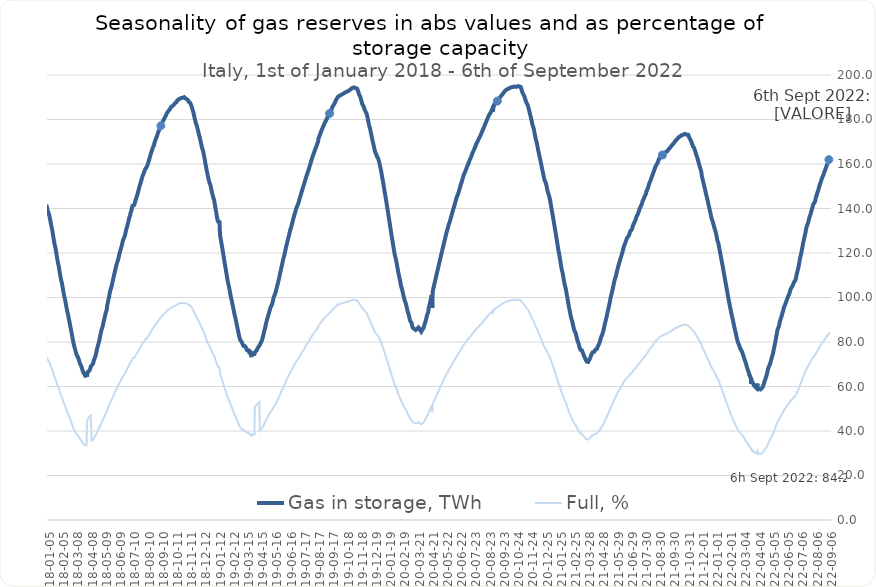
| Category | Gas in storage, TWh  | Full, %  |
|---|---|---|
| 2022-09-06 | 162.872 | 84.2 |
| 2022-09-05 | 162.35 | 83.93 |
| 2022-09-04 | 161.97 | 83.73 |
| 2022-09-03 | 161.345 | 83.41 |
| 2022-09-02 | 160.709 | 83.08 |
| 2022-09-01 | 160.45 | 82.94 |
| 2022-08-31 | 159.708 | 82.56 |
| 2022-08-30 | 159.123 | 82.26 |
| 2022-08-29 | 158.492 | 81.93 |
| 2022-08-28 | 158.041 | 81.7 |
| 2022-08-27 | 157.29 | 81.31 |
| 2022-08-26 | 156.754 | 81.03 |
| 2022-08-25 | 156.246 | 80.77 |
| 2022-08-24 | 155.674 | 80.48 |
| 2022-08-23 | 154.972 | 80.11 |
| 2022-08-22 | 154.606 | 79.92 |
| 2022-08-21 | 154.208 | 79.72 |
| 2022-08-20 | 153.574 | 79.39 |
| 2022-08-19 | 152.993 | 79.09 |
| 2022-08-18 | 152.321 | 78.74 |
| 2022-08-17 | 151.741 | 78.44 |
| 2022-08-16 | 151.262 | 78.19 |
| 2022-08-15 | 150.541 | 77.82 |
| 2022-08-14 | 149.829 | 77.45 |
| 2022-08-13 | 149.06 | 77.06 |
| 2022-08-12 | 148.337 | 76.68 |
| 2022-08-11 | 147.712 | 76.36 |
| 2022-08-10 | 147.062 | 76.02 |
| 2022-08-09 | 146.415 | 75.69 |
| 2022-08-08 | 145.812 | 75.38 |
| 2022-08-07 | 145.12 | 75.02 |
| 2022-08-06 | 144.162 | 74.52 |
| 2022-08-05 | 143.279 | 74.07 |
| 2022-08-04 | 142.737 | 73.79 |
| 2022-08-03 | 142.758 | 73.8 |
| 2022-08-02 | 142.344 | 73.58 |
| 2022-08-01 | 141.959 | 73.39 |
| 2022-07-31 | 141.071 | 72.93 |
| 2022-07-30 | 140.351 | 72.55 |
| 2022-07-29 | 139.663 | 72.2 |
| 2022-07-28 | 138.897 | 71.8 |
| 2022-07-27 | 138.176 | 71.43 |
| 2022-07-26 | 137.379 | 71.02 |
| 2022-07-25 | 136.782 | 70.71 |
| 2022-07-24 | 136.329 | 70.47 |
| 2022-07-23 | 135.423 | 70.01 |
| 2022-07-22 | 134.559 | 69.56 |
| 2022-07-21 | 133.817 | 69.18 |
| 2022-07-20 | 133.2 | 68.86 |
| 2022-07-19 | 132.765 | 68.63 |
| 2022-07-18 | 132.088 | 68.28 |
| 2022-07-17 | 131.308 | 67.88 |
| 2022-07-16 | 130.341 | 67.38 |
| 2022-07-15 | 129.196 | 66.79 |
| 2022-07-14 | 128.237 | 66.29 |
| 2022-07-13 | 127.342 | 65.83 |
| 2022-07-12 | 126.37 | 65.33 |
| 2022-07-11 | 125.412 | 64.83 |
| 2022-07-10 | 124.56 | 64.39 |
| 2022-07-09 | 123.361 | 63.77 |
| 2022-07-08 | 122.182 | 63.16 |
| 2022-07-07 | 121.145 | 62.63 |
| 2022-07-06 | 120.201 | 62.14 |
| 2022-07-05 | 119.195 | 61.62 |
| 2022-07-04 | 118.281 | 61.15 |
| 2022-07-03 | 117.458 | 60.72 |
| 2022-07-02 | 116.25 | 60.09 |
| 2022-07-01 | 115.113 | 59.51 |
| 2022-06-30 | 113.938 | 58.9 |
| 2022-06-29 | 113.019 | 58.42 |
| 2022-06-28 | 112.217 | 58.01 |
| 2022-06-27 | 111.326 | 57.55 |
| 2022-06-26 | 110.682 | 57.22 |
| 2022-06-25 | 109.508 | 56.61 |
| 2022-06-24 | 108.452 | 56.06 |
| 2022-06-23 | 107.787 | 55.72 |
| 2022-06-22 | 107.475 | 55.56 |
| 2022-06-21 | 107.175 | 55.4 |
| 2022-06-20 | 106.853 | 55.24 |
| 2022-06-19 | 106.544 | 55.08 |
| 2022-06-18 | 105.864 | 54.73 |
| 2022-06-17 | 105.258 | 54.41 |
| 2022-06-16 | 105.01 | 54.28 |
| 2022-06-15 | 104.635 | 54.09 |
| 2022-06-14 | 104.267 | 53.9 |
| 2022-06-13 | 103.844 | 53.68 |
| 2022-06-12 | 103.383 | 53.44 |
| 2022-06-11 | 102.596 | 53.04 |
| 2022-06-10 | 101.836 | 52.64 |
| 2022-06-09 | 101.353 | 52.39 |
| 2022-06-08 | 100.882 | 52.15 |
| 2022-06-07 | 100.378 | 51.89 |
| 2022-06-06 | 99.886 | 51.64 |
| 2022-06-05 | 99.495 | 51.43 |
| 2022-06-04 | 98.809 | 51.08 |
| 2022-06-03 | 98.16 | 50.74 |
| 2022-06-02 | 97.629 | 50.47 |
| 2022-06-01 | 96.947 | 50.12 |
| 2022-05-31 | 96.492 | 49.88 |
| 2022-05-30 | 96.059 | 49.66 |
| 2022-05-29 | 95.584 | 49.41 |
| 2022-05-28 | 94.672 | 48.94 |
| 2022-05-27 | 93.783 | 48.48 |
| 2022-05-26 | 93.183 | 48.17 |
| 2022-05-25 | 92.345 | 47.74 |
| 2022-05-24 | 91.61 | 47.36 |
| 2022-05-23 | 90.958 | 47.02 |
| 2022-05-22 | 90.49 | 46.78 |
| 2022-05-21 | 89.772 | 46.41 |
| 2022-05-20 | 89.124 | 46.07 |
| 2022-05-19 | 88.078 | 45.53 |
| 2022-05-18 | 87.054 | 45 |
| 2022-05-17 | 86.562 | 44.75 |
| 2022-05-16 | 86.134 | 44.53 |
| 2022-05-15 | 85.562 | 44.23 |
| 2022-05-14 | 84.343 | 43.6 |
| 2022-05-13 | 83.141 | 42.98 |
| 2022-05-12 | 81.998 | 42.39 |
| 2022-05-11 | 80.837 | 41.79 |
| 2022-05-10 | 79.805 | 41.26 |
| 2022-05-09 | 78.788 | 40.73 |
| 2022-05-08 | 77.761 | 40.2 |
| 2022-05-07 | 76.726 | 39.66 |
| 2022-05-06 | 75.699 | 39.13 |
| 2022-05-05 | 74.766 | 38.65 |
| 2022-05-04 | 74.09 | 38.3 |
| 2022-05-03 | 73.32 | 37.9 |
| 2022-05-02 | 72.615 | 37.54 |
| 2022-05-01 | 71.844 | 37.14 |
| 2022-04-30 | 70.967 | 36.69 |
| 2022-04-29 | 70.32 | 36.35 |
| 2022-04-28 | 69.77 | 36.07 |
| 2022-04-27 | 69.292 | 35.82 |
| 2022-04-26 | 68.952 | 34.83 |
| 2022-04-25 | 68.342 | 34.53 |
| 2022-04-24 | 67.465 | 34.08 |
| 2022-04-23 | 66.532 | 33.61 |
| 2022-04-22 | 65.647 | 33.16 |
| 2022-04-21 | 64.895 | 32.78 |
| 2022-04-20 | 64.196 | 32.43 |
| 2022-04-19 | 63.521 | 32.09 |
| 2022-04-18 | 63.172 | 31.91 |
| 2022-04-17 | 62.491 | 31.57 |
| 2022-04-16 | 61.784 | 31.21 |
| 2022-04-15 | 61.071 | 30.85 |
| 2022-04-14 | 60.462 | 30.54 |
| 2022-04-13 | 59.87 | 30.25 |
| 2022-04-12 | 59.554 | 30.09 |
| 2022-04-11 | 59.234 | 29.92 |
| 2022-04-10 | 59.031 | 29.82 |
| 2022-04-09 | 58.866 | 29.74 |
| 2022-04-08 | 58.72 | 29.66 |
| 2022-04-07 | 58.642 | 29.62 |
| 2022-04-06 | 59.042 | 29.83 |
| 2022-04-05 | 59.036 | 29.82 |
| 2022-04-04 | 59.034 | 29.82 |
| 2022-04-03 | 59.03 | 29.82 |
| 2022-04-02 | 59.012 | 30.19 |
| 2022-04-01 | 61.308 | 30.97 |
| 2022-03-31 | 59.16 | 29.92 |
| 2022-03-30 | 58.945 | 29.81 |
| 2022-03-29 | 59.321 | 30 |
| 2022-03-28 | 59.724 | 30.2 |
| 2022-03-27 | 60.119 | 30.4 |
| 2022-03-26 | 60.022 | 30.36 |
| 2022-03-25 | 60.402 | 30.55 |
| 2022-03-24 | 60.787 | 30.74 |
| 2022-03-23 | 61.212 | 30.96 |
| 2022-03-22 | 61.689 | 31.2 |
| 2022-03-21 | 62.172 | 31.44 |
| 2022-03-20 | 62.66 | 31.69 |
| 2022-03-19 | 61.152 | 30.93 |
| 2022-03-18 | 63.49 | 32.11 |
| 2022-03-17 | 63.977 | 32.36 |
| 2022-03-16 | 64.481 | 32.61 |
| 2022-03-15 | 65.002 | 32.87 |
| 2022-03-14 | 65.624 | 33.19 |
| 2022-03-13 | 66.428 | 33.59 |
| 2022-03-12 | 66.974 | 33.87 |
| 2022-03-11 | 67.6 | 34.19 |
| 2022-03-10 | 68.318 | 34.55 |
| 2022-03-09 | 68.959 | 34.87 |
| 2022-03-08 | 69.676 | 35.24 |
| 2022-03-07 | 70.396 | 35.6 |
| 2022-03-06 | 71.113 | 35.96 |
| 2022-03-05 | 71.677 | 36.25 |
| 2022-03-04 | 72.236 | 36.53 |
| 2022-03-03 | 72.896 | 36.87 |
| 2022-03-02 | 73.564 | 37.2 |
| 2022-03-01 | 74.172 | 37.51 |
| 2022-02-28 | 74.779 | 37.82 |
| 2022-02-27 | 75.546 | 38.21 |
| 2022-02-26 | 75.96 | 38.42 |
| 2022-02-25 | 76.254 | 38.56 |
| 2022-02-24 | 76.321 | 38.6 |
| 2022-02-23 | 76.935 | 38.91 |
| 2022-02-22 | 77.528 | 39.21 |
| 2022-02-21 | 78.14 | 39.52 |
| 2022-02-20 | 78.788 | 39.85 |
| 2022-02-19 | 79.162 | 40.03 |
| 2022-02-18 | 79.639 | 40.28 |
| 2022-02-17 | 80.402 | 40.66 |
| 2022-02-16 | 81.181 | 41.06 |
| 2022-02-15 | 82.035 | 41.49 |
| 2022-02-14 | 82.911 | 41.93 |
| 2022-02-13 | 83.946 | 42.45 |
| 2022-02-12 | 84.77 | 42.87 |
| 2022-02-11 | 85.626 | 43.3 |
| 2022-02-10 | 86.522 | 43.76 |
| 2022-02-09 | 87.49 | 44.25 |
| 2022-02-08 | 88.476 | 44.75 |
| 2022-02-07 | 89.513 | 45.27 |
| 2022-02-06 | 90.544 | 45.79 |
| 2022-02-05 | 91.314 | 46.18 |
| 2022-02-04 | 92.19 | 46.62 |
| 2022-02-03 | 93.178 | 47.12 |
| 2022-02-02 | 94.214 | 47.65 |
| 2022-02-01 | 95.256 | 48.17 |
| 2022-01-31 | 96.259 | 48.68 |
| 2022-01-30 | 97.384 | 49.25 |
| 2022-01-29 | 98.365 | 49.75 |
| 2022-01-28 | 99.469 | 50.3 |
| 2022-01-27 | 100.629 | 50.89 |
| 2022-01-26 | 101.806 | 51.49 |
| 2022-01-25 | 102.969 | 52.07 |
| 2022-01-24 | 104.146 | 52.67 |
| 2022-01-23 | 105.306 | 53.26 |
| 2022-01-22 | 106.374 | 53.8 |
| 2022-01-21 | 107.535 | 54.38 |
| 2022-01-20 | 108.709 | 54.98 |
| 2022-01-19 | 109.89 | 55.57 |
| 2022-01-18 | 111.066 | 56.17 |
| 2022-01-17 | 112.235 | 56.76 |
| 2022-01-16 | 113.414 | 57.36 |
| 2022-01-15 | 114.538 | 57.93 |
| 2022-01-14 | 115.612 | 58.47 |
| 2022-01-13 | 116.724 | 59.03 |
| 2022-01-12 | 117.832 | 59.59 |
| 2022-01-11 | 118.944 | 60.15 |
| 2022-01-10 | 120.019 | 60.7 |
| 2022-01-09 | 121.129 | 61.26 |
| 2022-01-08 | 122.224 | 61.81 |
| 2022-01-07 | 123.327 | 62.37 |
| 2022-01-06 | 124.41 | 62.92 |
| 2022-01-05 | 124.47 | 62.95 |
| 2022-01-04 | 125.514 | 63.48 |
| 2022-01-03 | 126.552 | 64 |
| 2022-01-02 | 127.629 | 64.55 |
| 2022-01-01 | 128.603 | 65.04 |
| 2021-12-31 | 129.45 | 65.47 |
| 2021-12-30 | 130.162 | 65.83 |
| 2021-12-29 | 130.854 | 66.18 |
| 2021-12-28 | 131.557 | 66.53 |
| 2021-12-27 | 132.347 | 66.93 |
| 2021-12-26 | 133.06 | 67.29 |
| 2021-12-25 | 133.837 | 67.69 |
| 2021-12-24 | 134.454 | 68 |
| 2021-12-23 | 135.062 | 68.31 |
| 2021-12-22 | 135.7 | 68.63 |
| 2021-12-21 | 136.714 | 69.14 |
| 2021-12-20 | 137.656 | 69.62 |
| 2021-12-19 | 138.596 | 70.09 |
| 2021-12-18 | 139.517 | 70.56 |
| 2021-12-17 | 140.426 | 71.02 |
| 2021-12-16 | 141.363 | 71.49 |
| 2021-12-15 | 142.287 | 71.96 |
| 2021-12-14 | 143.219 | 72.43 |
| 2021-12-13 | 144.085 | 72.87 |
| 2021-12-12 | 144.962 | 73.31 |
| 2021-12-11 | 145.824 | 73.75 |
| 2021-12-10 | 146.699 | 74.19 |
| 2021-12-09 | 147.574 | 74.63 |
| 2021-12-08 | 148.472 | 75.09 |
| 2021-12-07 | 149.364 | 75.54 |
| 2021-12-06 | 150.25 | 75.99 |
| 2021-12-05 | 151.138 | 76.44 |
| 2021-12-04 | 151.973 | 76.86 |
| 2021-12-03 | 152.817 | 77.28 |
| 2021-12-02 | 153.699 | 77.73 |
| 2021-12-01 | 154.587 | 78.18 |
| 2021-11-30 | 156.245 | 79.02 |
| 2021-11-29 | 157.044 | 79.42 |
| 2021-11-28 | 157.835 | 79.82 |
| 2021-11-27 | 158.416 | 80.12 |
| 2021-11-26 | 159.065 | 80.44 |
| 2021-11-25 | 159.848 | 80.84 |
| 2021-11-24 | 160.629 | 81.24 |
| 2021-11-23 | 161.408 | 81.63 |
| 2021-11-22 | 162.14 | 82 |
| 2021-11-21 | 162.91 | 82.39 |
| 2021-11-20 | 163.377 | 82.62 |
| 2021-11-19 | 163.963 | 82.92 |
| 2021-11-18 | 164.635 | 83.26 |
| 2021-11-17 | 165.386 | 83.64 |
| 2021-11-16 | 166.07 | 83.99 |
| 2021-11-15 | 166.657 | 84.28 |
| 2021-11-14 | 167.248 | 84.58 |
| 2021-11-13 | 167.47 | 84.69 |
| 2021-11-12 | 167.755 | 84.84 |
| 2021-11-11 | 168.324 | 85.13 |
| 2021-11-10 | 168.84 | 85.39 |
| 2021-11-09 | 169.423 | 85.68 |
| 2021-11-08 | 170.035 | 85.99 |
| 2021-11-07 | 170.576 | 86.27 |
| 2021-11-06 | 170.798 | 86.38 |
| 2021-11-05 | 171.193 | 86.58 |
| 2021-11-04 | 171.691 | 86.83 |
| 2021-11-03 | 172.202 | 87.09 |
| 2021-11-02 | 172.685 | 87.33 |
| 2021-11-01 | 173.16 | 87.57 |
| 2021-10-31 | 173.108 | 87.55 |
| 2021-10-30 | 173.121 | 87.55 |
| 2021-10-29 | 173.155 | 87.57 |
| 2021-10-28 | 173.207 | 87.6 |
| 2021-10-27 | 173.335 | 87.66 |
| 2021-10-26 | 173.49 | 87.74 |
| 2021-10-25 | 173.563 | 87.78 |
| 2021-10-24 | 173.6 | 87.79 |
| 2021-10-23 | 173.409 | 87.7 |
| 2021-10-22 | 173.301 | 87.64 |
| 2021-10-21 | 173.305 | 87.65 |
| 2021-10-20 | 172.997 | 87.49 |
| 2021-10-19 | 172.911 | 87.45 |
| 2021-10-18 | 172.916 | 87.45 |
| 2021-10-17 | 172.871 | 87.43 |
| 2021-10-16 | 172.601 | 87.29 |
| 2021-10-15 | 172.42 | 87.2 |
| 2021-10-14 | 172.367 | 87.17 |
| 2021-10-13 | 172.243 | 87.11 |
| 2021-10-12 | 172.102 | 87.04 |
| 2021-10-11 | 171.944 | 86.96 |
| 2021-10-10 | 171.813 | 86.89 |
| 2021-10-09 | 171.438 | 86.7 |
| 2021-10-08 | 171.078 | 86.52 |
| 2021-10-07 | 170.933 | 86.45 |
| 2021-10-06 | 170.767 | 86.36 |
| 2021-10-05 | 170.573 | 86.26 |
| 2021-10-04 | 170.346 | 86.15 |
| 2021-10-03 | 170.125 | 86.04 |
| 2021-10-02 | 169.728 | 85.84 |
| 2021-10-01 | 169.337 | 85.64 |
| 2021-09-30 | 169.153 | 85.55 |
| 2021-09-29 | 168.912 | 85.42 |
| 2021-09-28 | 168.725 | 85.33 |
| 2021-09-27 | 168.62 | 85.28 |
| 2021-09-26 | 168.429 | 85.18 |
| 2021-09-25 | 167.951 | 84.94 |
| 2021-09-24 | 167.562 | 84.74 |
| 2021-09-23 | 167.392 | 84.66 |
| 2021-09-22 | 167.218 | 84.57 |
| 2021-09-21 | 167.013 | 84.46 |
| 2021-09-20 | 166.819 | 84.37 |
| 2021-09-19 | 166.583 | 84.25 |
| 2021-09-18 | 166.174 | 84.04 |
| 2021-09-17 | 165.818 | 83.86 |
| 2021-09-16 | 165.607 | 83.75 |
| 2021-09-15 | 165.548 | 83.72 |
| 2021-09-14 | 165.456 | 83.68 |
| 2021-09-13 | 165.402 | 83.65 |
| 2021-09-12 | 165.285 | 83.59 |
| 2021-09-11 | 164.949 | 83.42 |
| 2021-09-10 | 164.711 | 83.3 |
| 2021-09-09 | 164.507 | 83.2 |
| 2021-09-08 | 164.312 | 83.1 |
| 2021-09-07 | 164.191 | 83.04 |
| 2021-09-06 | 164.057 | 82.97 |
| 2021-09-05 | 163.673 | 82.77 |
| 2021-09-04 | 163.307 | 82.59 |
| 2021-09-03 | 163.072 | 82.47 |
| 2021-09-02 | 162.993 | 82.43 |
| 2021-09-01 | 162.846 | 82.36 |
| 2021-08-31 | 162.735 | 82.3 |
| 2021-08-30 | 162.465 | 82.16 |
| 2021-08-29 | 162.07 | 81.96 |
| 2021-08-28 | 161.401 | 81.63 |
| 2021-08-27 | 160.776 | 81.31 |
| 2021-08-26 | 160.318 | 81.08 |
| 2021-08-25 | 159.985 | 80.91 |
| 2021-08-24 | 159.661 | 80.75 |
| 2021-08-23 | 159.333 | 80.58 |
| 2021-08-22 | 158.908 | 80.36 |
| 2021-08-21 | 158.325 | 80.07 |
| 2021-08-20 | 157.735 | 79.77 |
| 2021-08-19 | 157.098 | 79.45 |
| 2021-08-18 | 156.551 | 79.17 |
| 2021-08-17 | 155.996 | 78.89 |
| 2021-08-16 | 155.424 | 78.6 |
| 2021-08-15 | 154.879 | 78.33 |
| 2021-08-14 | 154.307 | 78.04 |
| 2021-08-13 | 153.666 | 77.71 |
| 2021-08-12 | 153.137 | 77.45 |
| 2021-08-11 | 152.571 | 77.16 |
| 2021-08-10 | 152.242 | 76.99 |
| 2021-08-09 | 151.635 | 76.69 |
| 2021-08-08 | 151.059 | 76.4 |
| 2021-08-07 | 150.346 | 76.03 |
| 2021-08-06 | 149.635 | 75.68 |
| 2021-08-05 | 149.03 | 75.37 |
| 2021-08-04 | 148.503 | 75.1 |
| 2021-08-03 | 148.064 | 74.88 |
| 2021-08-02 | 147.627 | 74.66 |
| 2021-08-01 | 146.545 | 74.11 |
| 2021-07-31 | 146.464 | 74.07 |
| 2021-07-30 | 145.83 | 73.75 |
| 2021-07-29 | 145.323 | 73.49 |
| 2021-07-28 | 144.826 | 73.24 |
| 2021-07-27 | 144.308 | 72.98 |
| 2021-07-26 | 143.91 | 72.78 |
| 2021-07-25 | 143.47 | 72.56 |
| 2021-07-24 | 142.742 | 72.19 |
| 2021-07-23 | 142.017 | 71.82 |
| 2021-07-22 | 141.524 | 71.57 |
| 2021-07-21 | 141.085 | 71.35 |
| 2021-07-20 | 140.65 | 71.13 |
| 2021-07-19 | 140.2 | 70.9 |
| 2021-07-18 | 139.741 | 70.67 |
| 2021-07-17 | 138.992 | 70.29 |
| 2021-07-16 | 138.35 | 69.97 |
| 2021-07-15 | 137.857 | 69.72 |
| 2021-07-14 | 137.368 | 69.47 |
| 2021-07-13 | 136.888 | 69.23 |
| 2021-07-12 | 136.474 | 69.02 |
| 2021-07-11 | 136.109 | 68.83 |
| 2021-07-10 | 135.384 | 68.47 |
| 2021-07-09 | 134.709 | 68.13 |
| 2021-07-08 | 134.257 | 67.9 |
| 2021-07-07 | 133.802 | 67.67 |
| 2021-07-06 | 133.398 | 67.46 |
| 2021-07-05 | 132.944 | 67.23 |
| 2021-07-04 | 132.436 | 66.98 |
| 2021-07-03 | 131.705 | 66.61 |
| 2021-07-02 | 131.007 | 66.25 |
| 2021-07-01 | 130.516 | 66.01 |
| 2021-06-30 | 130.417 | 65.96 |
| 2021-06-29 | 130.188 | 65.84 |
| 2021-06-28 | 129.804 | 65.65 |
| 2021-06-27 | 129.339 | 65.41 |
| 2021-06-26 | 128.6 | 65.04 |
| 2021-06-25 | 127.922 | 64.69 |
| 2021-06-24 | 127.578 | 64.52 |
| 2021-06-23 | 127.344 | 64.4 |
| 2021-06-22 | 127.108 | 64.28 |
| 2021-06-21 | 126.763 | 64.11 |
| 2021-06-20 | 126.445 | 63.95 |
| 2021-06-19 | 125.748 | 63.59 |
| 2021-06-18 | 125.085 | 63.26 |
| 2021-06-17 | 124.523 | 62.98 |
| 2021-06-16 | 124.033 | 62.73 |
| 2021-06-15 | 123.514 | 62.46 |
| 2021-06-14 | 122.902 | 62.16 |
| 2021-06-13 | 122.205 | 61.8 |
| 2021-06-12 | 121.389 | 61.39 |
| 2021-06-11 | 120.574 | 60.98 |
| 2021-06-10 | 119.816 | 60.59 |
| 2021-06-09 | 119.094 | 60.23 |
| 2021-06-08 | 118.48 | 59.92 |
| 2021-06-07 | 117.828 | 59.59 |
| 2021-06-06 | 117.188 | 59.27 |
| 2021-06-05 | 116.373 | 58.85 |
| 2021-06-04 | 115.669 | 58.5 |
| 2021-06-03 | 114.982 | 58.15 |
| 2021-06-02 | 114.275 | 57.79 |
| 2021-06-01 | 113.483 | 57.39 |
| 2021-05-31 | 112.844 | 57.07 |
| 2021-05-30 | 112.013 | 56.65 |
| 2021-05-29 | 111.018 | 56.15 |
| 2021-05-28 | 110.033 | 55.65 |
| 2021-05-27 | 109.281 | 55.27 |
| 2021-05-26 | 108.714 | 54.98 |
| 2021-05-25 | 108.03 | 54.63 |
| 2021-05-24 | 107.144 | 54.19 |
| 2021-05-23 | 106.264 | 53.74 |
| 2021-05-22 | 105.196 | 53.2 |
| 2021-05-21 | 104.126 | 52.66 |
| 2021-05-20 | 103.231 | 52.21 |
| 2021-05-19 | 102.319 | 51.75 |
| 2021-05-18 | 101.621 | 51.39 |
| 2021-05-17 | 100.796 | 50.98 |
| 2021-05-16 | 99.885 | 50.51 |
| 2021-05-15 | 98.809 | 49.97 |
| 2021-05-14 | 97.741 | 49.43 |
| 2021-05-13 | 96.763 | 48.94 |
| 2021-05-12 | 95.831 | 48.46 |
| 2021-05-11 | 94.904 | 48 |
| 2021-05-10 | 93.985 | 47.53 |
| 2021-05-09 | 93.055 | 47.06 |
| 2021-05-08 | 92.051 | 46.55 |
| 2021-05-07 | 91.074 | 46.06 |
| 2021-05-06 | 90.228 | 45.63 |
| 2021-05-05 | 89.363 | 45.19 |
| 2021-05-04 | 88.539 | 44.78 |
| 2021-05-03 | 87.658 | 44.33 |
| 2021-05-02 | 86.828 | 43.91 |
| 2021-05-01 | 85.801 | 43.39 |
| 2021-04-30 | 84.868 | 42.92 |
| 2021-04-29 | 84.199 | 42.58 |
| 2021-04-28 | 83.495 | 42.23 |
| 2021-04-27 | 82.95 | 41.95 |
| 2021-04-26 | 82.618 | 41.78 |
| 2021-04-25 | 82.034 | 41.49 |
| 2021-04-24 | 81.236 | 41.08 |
| 2021-04-23 | 80.411 | 40.67 |
| 2021-04-22 | 79.762 | 40.34 |
| 2021-04-21 | 79.238 | 40.07 |
| 2021-04-20 | 78.807 | 39.86 |
| 2021-04-19 | 78.449 | 39.67 |
| 2021-04-18 | 78.08 | 39.49 |
| 2021-04-17 | 77.477 | 39.18 |
| 2021-04-16 | 76.899 | 38.89 |
| 2021-04-15 | 76.636 | 38.76 |
| 2021-04-14 | 76.613 | 38.75 |
| 2021-04-13 | 76.599 | 38.74 |
| 2021-04-12 | 76.486 | 38.68 |
| 2021-04-11 | 76.282 | 38.58 |
| 2021-04-10 | 75.564 | 38.22 |
| 2021-04-09 | 75.475 | 38.17 |
| 2021-04-08 | 75.434 | 38.15 |
| 2021-04-07 | 75.414 | 38.14 |
| 2021-04-06 | 75.393 | 38.13 |
| 2021-04-05 | 75.037 | 37.95 |
| 2021-04-04 | 74.394 | 37.62 |
| 2021-04-03 | 73.783 | 37.31 |
| 2021-04-02 | 73.179 | 37.01 |
| 2021-04-01 | 72.746 | 36.79 |
| 2021-03-31 | 72.098 | 36.59 |
| 2021-03-30 | 71.85 | 36.49 |
| 2021-03-29 | 71.632 | 36.38 |
| 2021-03-28 | 71.057 | 36.09 |
| 2021-03-27 | 71.096 | 36.11 |
| 2021-03-26 | 71.135 | 36.13 |
| 2021-03-25 | 71.201 | 36.16 |
| 2021-03-24 | 71.431 | 36.28 |
| 2021-03-23 | 71.872 | 36.51 |
| 2021-03-22 | 72.395 | 36.77 |
| 2021-03-21 | 72.916 | 37.04 |
| 2021-03-20 | 73.195 | 37.18 |
| 2021-03-19 | 73.68 | 37.42 |
| 2021-03-18 | 74.314 | 37.75 |
| 2021-03-17 | 74.853 | 38.02 |
| 2021-03-16 | 75.326 | 38.26 |
| 2021-03-15 | 75.852 | 38.53 |
| 2021-03-14 | 76.331 | 38.77 |
| 2021-03-13 | 76.322 | 38.77 |
| 2021-03-12 | 76.318 | 38.76 |
| 2021-03-11 | 76.536 | 38.87 |
| 2021-03-10 | 77.125 | 39.17 |
| 2021-03-09 | 77.754 | 39.49 |
| 2021-03-08 | 78.597 | 39.92 |
| 2021-03-07 | 79.446 | 40.35 |
| 2021-03-06 | 79.959 | 40.61 |
| 2021-03-05 | 80.49 | 40.88 |
| 2021-03-04 | 81.173 | 41.23 |
| 2021-03-03 | 81.993 | 41.65 |
| 2021-03-02 | 82.807 | 42.06 |
| 2021-03-01 | 83.626 | 42.48 |
| 2021-02-28 | 84.449 | 42.89 |
| 2021-02-27 | 84.77 | 43.06 |
| 2021-02-26 | 85.064 | 43.21 |
| 2021-02-25 | 85.835 | 43.6 |
| 2021-02-24 | 86.72 | 44.05 |
| 2021-02-23 | 87.634 | 44.51 |
| 2021-02-22 | 88.587 | 45 |
| 2021-02-21 | 89.504 | 45.46 |
| 2021-02-20 | 90.009 | 45.72 |
| 2021-02-19 | 90.783 | 46.11 |
| 2021-02-18 | 91.767 | 46.61 |
| 2021-02-17 | 92.793 | 47.13 |
| 2021-02-16 | 93.818 | 47.65 |
| 2021-02-15 | 94.844 | 48.17 |
| 2021-02-14 | 95.868 | 48.69 |
| 2021-02-13 | 97.051 | 49.29 |
| 2021-02-12 | 98.249 | 49.9 |
| 2021-02-11 | 99.46 | 50.52 |
| 2021-02-10 | 100.609 | 51.1 |
| 2021-02-09 | 101.784 | 51.7 |
| 2021-02-08 | 102.984 | 52.31 |
| 2021-02-07 | 104.141 | 52.9 |
| 2021-02-06 | 104.854 | 53.26 |
| 2021-02-05 | 105.569 | 53.62 |
| 2021-02-04 | 106.702 | 54.2 |
| 2021-02-03 | 107.831 | 54.77 |
| 2021-02-02 | 108.964 | 55.35 |
| 2021-02-01 | 110.19 | 55.97 |
| 2021-01-31 | 111.411 | 56.59 |
| 2021-01-30 | 112.082 | 56.93 |
| 2021-01-29 | 112.944 | 57.37 |
| 2021-01-28 | 114.198 | 58 |
| 2021-01-27 | 115.531 | 58.68 |
| 2021-01-26 | 116.871 | 59.36 |
| 2021-01-25 | 118.113 | 59.99 |
| 2021-01-24 | 119.375 | 60.63 |
| 2021-01-23 | 120.334 | 61.12 |
| 2021-01-22 | 121.416 | 61.67 |
| 2021-01-21 | 122.658 | 62.3 |
| 2021-01-20 | 123.998 | 62.98 |
| 2021-01-19 | 125.311 | 63.65 |
| 2021-01-18 | 126.62 | 64.31 |
| 2021-01-17 | 127.96 | 64.99 |
| 2021-01-16 | 129.185 | 65.62 |
| 2021-01-15 | 130.308 | 66.19 |
| 2021-01-14 | 131.573 | 66.83 |
| 2021-01-13 | 132.838 | 67.47 |
| 2021-01-12 | 134.071 | 68.1 |
| 2021-01-11 | 135.341 | 68.74 |
| 2021-01-10 | 136.613 | 69.39 |
| 2021-01-09 | 137.667 | 69.92 |
| 2021-01-08 | 138.85 | 70.53 |
| 2021-01-07 | 140.043 | 71.13 |
| 2021-01-06 | 141.31 | 71.77 |
| 2021-01-05 | 142.426 | 72.34 |
| 2021-01-04 | 143.691 | 72.98 |
| 2021-01-03 | 144.704 | 73.5 |
| 2021-01-02 | 145.488 | 73.9 |
| 2021-01-01 | 146.22 | 74.27 |
| 2020-12-31 | 146.909 | 74.62 |
| 2020-12-30 | 147.5 | 74.92 |
| 2020-12-29 | 148.244 | 75.3 |
| 2020-12-28 | 149.346 | 75.86 |
| 2020-12-27 | 150.365 | 76.37 |
| 2020-12-26 | 151.233 | 76.82 |
| 2020-12-25 | 151.868 | 77.14 |
| 2020-12-24 | 152.212 | 77.31 |
| 2020-12-23 | 152.633 | 77.53 |
| 2020-12-22 | 153.52 | 77.98 |
| 2020-12-21 | 154.524 | 78.49 |
| 2020-12-20 | 155.558 | 79.01 |
| 2020-12-19 | 156.446 | 79.46 |
| 2020-12-18 | 157.403 | 79.95 |
| 2020-12-17 | 158.441 | 80.48 |
| 2020-12-16 | 159.487 | 81.01 |
| 2020-12-15 | 160.545 | 81.54 |
| 2020-12-14 | 161.497 | 82.03 |
| 2020-12-13 | 162.506 | 82.54 |
| 2020-12-12 | 163.33 | 82.96 |
| 2020-12-11 | 164.317 | 83.46 |
| 2020-12-10 | 165.324 | 83.97 |
| 2020-12-09 | 166.036 | 84.33 |
| 2020-12-08 | 167.404 | 85.03 |
| 2020-12-07 | 168.419 | 85.54 |
| 2020-12-06 | 169.436 | 86.06 |
| 2020-12-05 | 170.308 | 86.5 |
| 2020-12-04 | 170.903 | 86.81 |
| 2020-12-03 | 171.925 | 87.32 |
| 2020-12-02 | 172.946 | 87.84 |
| 2020-12-01 | 173.957 | 88.36 |
| 2020-11-30 | 175.252 | 89.01 |
| 2020-11-29 | 176.136 | 89.46 |
| 2020-11-28 | 176.654 | 89.73 |
| 2020-11-27 | 177.368 | 90.09 |
| 2020-11-26 | 178.262 | 90.54 |
| 2020-11-25 | 179.156 | 91 |
| 2020-11-24 | 180.042 | 91.45 |
| 2020-11-23 | 180.936 | 91.9 |
| 2020-11-22 | 181.825 | 92.35 |
| 2020-11-21 | 182.661 | 92.78 |
| 2020-11-20 | 183.485 | 93.2 |
| 2020-11-19 | 184.34 | 93.63 |
| 2020-11-18 | 185.195 | 94.07 |
| 2020-11-17 | 185.963 | 94.46 |
| 2020-11-16 | 186.522 | 94.74 |
| 2020-11-15 | 187.009 | 94.99 |
| 2020-11-14 | 187.32 | 95.14 |
| 2020-11-13 | 187.744 | 95.36 |
| 2020-11-12 | 188.35 | 95.67 |
| 2020-11-11 | 189.003 | 96 |
| 2020-11-10 | 189.646 | 96.33 |
| 2020-11-09 | 190.303 | 96.66 |
| 2020-11-08 | 190.887 | 96.96 |
| 2020-11-07 | 191.207 | 97.12 |
| 2020-11-06 | 191.521 | 97.28 |
| 2020-11-05 | 191.974 | 97.51 |
| 2020-11-04 | 192.605 | 97.83 |
| 2020-11-03 | 193.186 | 98.12 |
| 2020-11-02 | 193.894 | 98.48 |
| 2020-11-01 | 194.594 | 98.84 |
| 2020-10-31 | 194.927 | 99.01 |
| 2020-10-30 | 194.875 | 98.98 |
| 2020-10-29 | 194.876 | 98.98 |
| 2020-10-28 | 194.946 | 99.02 |
| 2020-10-27 | 194.983 | 99.04 |
| 2020-10-26 | 195.014 | 99.05 |
| 2020-10-25 | 194.762 | 98.92 |
| 2020-10-24 | 194.725 | 98.91 |
| 2020-10-23 | 194.69 | 98.89 |
| 2020-10-22 | 194.675 | 98.88 |
| 2020-10-21 | 194.674 | 98.88 |
| 2020-10-20 | 194.698 | 98.89 |
| 2020-10-19 | 194.863 | 98.98 |
| 2020-10-18 | 194.88 | 98.98 |
| 2020-10-17 | 194.791 | 98.94 |
| 2020-10-16 | 194.707 | 98.9 |
| 2020-10-15 | 194.661 | 98.87 |
| 2020-10-14 | 194.606 | 98.84 |
| 2020-10-13 | 194.576 | 98.83 |
| 2020-10-12 | 194.574 | 98.83 |
| 2020-10-11 | 194.494 | 98.79 |
| 2020-10-10 | 194.377 | 98.73 |
| 2020-10-09 | 194.264 | 98.67 |
| 2020-10-08 | 194.151 | 98.61 |
| 2020-10-07 | 194.044 | 98.56 |
| 2020-10-06 | 193.943 | 98.51 |
| 2020-10-05 | 193.84 | 98.46 |
| 2020-10-04 | 193.751 | 98.41 |
| 2020-10-03 | 193.637 | 98.35 |
| 2020-10-02 | 193.521 | 98.29 |
| 2020-10-01 | 193.417 | 98.24 |
| 2020-09-30 | 193.334 | 98.2 |
| 2020-09-29 | 193.117 | 98.09 |
| 2020-09-28 | 192.916 | 97.99 |
| 2020-09-27 | 192.699 | 97.88 |
| 2020-09-26 | 192.414 | 97.73 |
| 2020-09-25 | 192.113 | 97.58 |
| 2020-09-24 | 191.826 | 97.43 |
| 2020-09-23 | 191.567 | 97.3 |
| 2020-09-22 | 191.315 | 97.17 |
| 2020-09-21 | 191.08 | 97.05 |
| 2020-09-20 | 190.801 | 96.91 |
| 2020-09-19 | 190.514 | 96.77 |
| 2020-09-18 | 190.249 | 96.63 |
| 2020-09-17 | 189.994 | 96.5 |
| 2020-09-16 | 189.787 | 96.4 |
| 2020-09-15 | 189.564 | 96.28 |
| 2020-09-14 | 189.345 | 96.17 |
| 2020-09-13 | 189.013 | 96 |
| 2020-09-12 | 188.666 | 95.83 |
| 2020-09-11 | 188.314 | 95.65 |
| 2020-09-10 | 188.047 | 95.51 |
| 2020-09-09 | 187.835 | 95.41 |
| 2020-09-08 | 187.545 | 95.26 |
| 2020-09-07 | 187.278 | 95.12 |
| 2020-09-06 | 187.027 | 95 |
| 2020-09-05 | 186.674 | 94.82 |
| 2020-09-04 | 186.323 | 94.64 |
| 2020-09-03 | 185.981 | 94.46 |
| 2020-09-02 | 185.655 | 94.3 |
| 2020-09-01 | 183.521 | 93.21 |
| 2020-08-31 | 184.812 | 93.87 |
| 2020-08-30 | 184.497 | 93.71 |
| 2020-08-29 | 183.881 | 93.4 |
| 2020-08-28 | 183.407 | 93.16 |
| 2020-08-27 | 183.045 | 92.97 |
| 2020-08-26 | 182.709 | 92.8 |
| 2020-08-25 | 182.49 | 92.69 |
| 2020-08-24 | 182.134 | 92.51 |
| 2020-08-23 | 181.707 | 92.29 |
| 2020-08-22 | 181.192 | 92.03 |
| 2020-08-21 | 180.684 | 91.77 |
| 2020-08-20 | 180.172 | 91.51 |
| 2020-08-19 | 179.68 | 91.26 |
| 2020-08-18 | 179.172 | 91.01 |
| 2020-08-17 | 178.673 | 90.75 |
| 2020-08-16 | 178.209 | 90.52 |
| 2020-08-15 | 177.681 | 90.25 |
| 2020-08-14 | 177.151 | 89.98 |
| 2020-08-13 | 176.645 | 89.72 |
| 2020-08-12 | 176.149 | 89.47 |
| 2020-08-11 | 175.694 | 89.24 |
| 2020-08-10 | 175.235 | 89.01 |
| 2020-08-09 | 174.796 | 88.78 |
| 2020-08-08 | 174.268 | 88.52 |
| 2020-08-07 | 173.739 | 88.25 |
| 2020-08-06 | 173.219 | 87.98 |
| 2020-08-05 | 172.754 | 87.75 |
| 2020-08-04 | 172.351 | 87.54 |
| 2020-08-03 | 171.973 | 87.35 |
| 2020-08-02 | 171.634 | 87.18 |
| 2020-08-01 | 171.116 | 86.91 |
| 2020-07-31 | 170.629 | 86.67 |
| 2020-07-30 | 170.171 | 86.43 |
| 2020-07-29 | 169.798 | 86.24 |
| 2020-07-28 | 169.428 | 86.06 |
| 2020-07-27 | 169.02 | 85.85 |
| 2020-07-26 | 168.558 | 85.61 |
| 2020-07-25 | 167.932 | 85.3 |
| 2020-07-24 | 167.316 | 84.98 |
| 2020-07-23 | 166.915 | 84.78 |
| 2020-07-22 | 166.497 | 84.57 |
| 2020-07-21 | 166.001 | 84.32 |
| 2020-07-20 | 165.535 | 84.08 |
| 2020-07-19 | 165.084 | 83.85 |
| 2020-07-18 | 164.427 | 83.52 |
| 2020-07-17 | 163.889 | 83.24 |
| 2020-07-16 | 163.374 | 82.98 |
| 2020-07-15 | 162.856 | 82.72 |
| 2020-07-14 | 162.45 | 82.51 |
| 2020-07-13 | 161.981 | 82.27 |
| 2020-07-12 | 161.472 | 82.02 |
| 2020-07-11 | 160.886 | 81.72 |
| 2020-07-10 | 160.334 | 81.44 |
| 2020-07-09 | 159.818 | 81.18 |
| 2020-07-08 | 159.331 | 80.93 |
| 2020-07-07 | 158.835 | 80.68 |
| 2020-07-06 | 158.296 | 80.4 |
| 2020-07-05 | 157.733 | 80.12 |
| 2020-07-04 | 157.207 | 79.85 |
| 2020-07-03 | 156.676 | 79.58 |
| 2020-07-02 | 156.201 | 79.34 |
| 2020-07-01 | 155.713 | 79.09 |
| 2020-06-30 | 155.323 | 78.89 |
| 2020-06-29 | 154.623 | 78.54 |
| 2020-06-28 | 153.942 | 78.19 |
| 2020-06-27 | 153.225 | 77.83 |
| 2020-06-26 | 152.54 | 77.48 |
| 2020-06-25 | 151.815 | 77.11 |
| 2020-06-24 | 151.193 | 76.79 |
| 2020-06-23 | 150.559 | 76.47 |
| 2020-06-22 | 149.839 | 76.11 |
| 2020-06-21 | 149.114 | 75.74 |
| 2020-06-20 | 148.402 | 75.38 |
| 2020-06-19 | 147.662 | 75 |
| 2020-06-18 | 146.946 | 74.64 |
| 2020-06-17 | 146.357 | 74.34 |
| 2020-06-16 | 145.936 | 74.12 |
| 2020-06-15 | 145.486 | 73.9 |
| 2020-06-14 | 144.81 | 73.55 |
| 2020-06-13 | 144.068 | 73.18 |
| 2020-06-12 | 143.325 | 72.8 |
| 2020-06-11 | 142.588 | 72.42 |
| 2020-06-10 | 141.853 | 72.05 |
| 2020-06-09 | 141.143 | 71.69 |
| 2020-06-08 | 140.512 | 71.37 |
| 2020-06-07 | 139.823 | 71.02 |
| 2020-06-06 | 139.1 | 70.65 |
| 2020-06-05 | 138.363 | 70.28 |
| 2020-06-04 | 137.62 | 69.9 |
| 2020-06-03 | 136.88 | 69.52 |
| 2020-06-02 | 136.148 | 69.15 |
| 2020-06-01 | 135.449 | 68.8 |
| 2020-05-31 | 134.705 | 68.42 |
| 2020-05-30 | 133.977 | 68.05 |
| 2020-05-29 | 133.379 | 67.75 |
| 2020-05-28 | 132.85 | 67.48 |
| 2020-05-27 | 131.958 | 67.02 |
| 2020-05-26 | 131.302 | 66.69 |
| 2020-05-25 | 130.639 | 66.35 |
| 2020-05-24 | 129.87 | 65.96 |
| 2020-05-23 | 129.092 | 65.57 |
| 2020-05-22 | 128.232 | 65.13 |
| 2020-05-21 | 127.352 | 64.69 |
| 2020-05-20 | 126.521 | 64.26 |
| 2020-05-19 | 125.674 | 63.83 |
| 2020-05-18 | 124.834 | 63.41 |
| 2020-05-17 | 123.984 | 62.97 |
| 2020-05-16 | 123.091 | 62.52 |
| 2020-05-15 | 122.238 | 62.09 |
| 2020-05-14 | 121.388 | 61.66 |
| 2020-05-13 | 120.52 | 61.21 |
| 2020-05-12 | 119.667 | 60.78 |
| 2020-05-11 | 118.813 | 60.35 |
| 2020-05-10 | 117.928 | 59.9 |
| 2020-05-09 | 117.022 | 59.44 |
| 2020-05-08 | 116.136 | 58.99 |
| 2020-05-07 | 115.257 | 58.54 |
| 2020-05-06 | 114.357 | 58.08 |
| 2020-05-05 | 113.476 | 57.64 |
| 2020-05-04 | 112.618 | 57.2 |
| 2020-05-03 | 111.715 | 56.74 |
| 2020-05-02 | 110.823 | 56.29 |
| 2020-05-01 | 110.052 | 55.9 |
| 2020-04-30 | 109.016 | 55.37 |
| 2020-04-29 | 108.133 | 54.92 |
| 2020-04-28 | 107.227 | 54.46 |
| 2020-04-27 | 106.355 | 54.02 |
| 2020-04-26 | 105.501 | 53.59 |
| 2020-04-25 | 104.605 | 53.13 |
| 2020-04-24 | 103.71 | 52.68 |
| 2020-04-23 | 102.819 | 52.22 |
| 2020-04-22 | 95.363 | 48.44 |
| 2020-04-21 | 101.067 | 51.33 |
| 2020-04-20 | 100.2 | 50.89 |
| 2020-04-19 | 99.337 | 50.46 |
| 2020-04-18 | 98.473 | 50.02 |
| 2020-04-17 | 97.6 | 49.57 |
| 2020-04-16 | 96.712 | 49.12 |
| 2020-04-15 | 95.858 | 48.69 |
| 2020-04-14 | 94.979 | 48.24 |
| 2020-04-13 | 93.28 | 47.38 |
| 2020-04-12 | 93.236 | 47.36 |
| 2020-04-11 | 92.388 | 46.93 |
| 2020-04-10 | 91.526 | 46.49 |
| 2020-04-09 | 90.668 | 46.05 |
| 2020-04-08 | 89.8 | 45.61 |
| 2020-04-07 | 89.067 | 45.24 |
| 2020-04-06 | 88.431 | 44.92 |
| 2020-04-05 | 87.788 | 44.59 |
| 2020-04-04 | 87.059 | 44.22 |
| 2020-04-03 | 86.318 | 43.84 |
| 2020-04-02 | 85.952 | 43.66 |
| 2020-04-01 | 85.747 | 43.55 |
| 2020-03-31 | 85.563 | 43.46 |
| 2020-03-30 | 85.57 | 43.46 |
| 2020-03-29 | 84.646 | 42.99 |
| 2020-03-28 | 84.972 | 43.16 |
| 2020-03-27 | 85.298 | 43.32 |
| 2020-03-26 | 85.629 | 43.49 |
| 2020-03-25 | 85.985 | 43.67 |
| 2020-03-24 | 86.3 | 43.83 |
| 2020-03-23 | 86.5 | 43.94 |
| 2020-03-22 | 86.702 | 44.04 |
| 2020-03-21 | 86.356 | 43.86 |
| 2020-03-20 | 85.878 | 43.62 |
| 2020-03-19 | 85.652 | 43.5 |
| 2020-03-18 | 85.46 | 43.41 |
| 2020-03-17 | 85.403 | 43.38 |
| 2020-03-16 | 85.656 | 43.51 |
| 2020-03-15 | 85.789 | 43.57 |
| 2020-03-14 | 85.853 | 43.61 |
| 2020-03-13 | 85.987 | 43.67 |
| 2020-03-12 | 86.117 | 43.74 |
| 2020-03-11 | 86.269 | 43.82 |
| 2020-03-10 | 86.73 | 44.05 |
| 2020-03-09 | 87.348 | 44.37 |
| 2020-03-08 | 88.487 | 44.94 |
| 2020-03-07 | 88.764 | 45.09 |
| 2020-03-06 | 88.822 | 45.11 |
| 2020-03-05 | 89.46 | 45.44 |
| 2020-03-04 | 90.202 | 45.93 |
| 2020-03-03 | 91.055 | 46.37 |
| 2020-03-02 | 91.907 | 46.8 |
| 2020-03-01 | 92.734 | 47.22 |
| 2020-02-29 | 93.221 | 47.47 |
| 2020-02-28 | 93.991 | 47.86 |
| 2020-02-27 | 94.883 | 48.32 |
| 2020-02-26 | 95.871 | 48.82 |
| 2020-02-25 | 96.752 | 49.27 |
| 2020-02-24 | 97.381 | 49.59 |
| 2020-02-23 | 98.115 | 49.96 |
| 2020-02-22 | 98.613 | 50.22 |
| 2020-02-21 | 99.22 | 50.53 |
| 2020-02-20 | 100.156 | 51 |
| 2020-02-19 | 101.04 | 51.45 |
| 2020-02-18 | 101.992 | 51.94 |
| 2020-02-17 | 102.964 | 52.43 |
| 2020-02-16 | 103.864 | 52.89 |
| 2020-02-15 | 104.443 | 53.18 |
| 2020-02-14 | 105.12 | 53.53 |
| 2020-02-13 | 106.149 | 54.05 |
| 2020-02-12 | 107.33 | 54.66 |
| 2020-02-11 | 108.275 | 55.14 |
| 2020-02-10 | 109.201 | 55.61 |
| 2020-02-09 | 110.292 | 56.16 |
| 2020-02-08 | 111.218 | 56.63 |
| 2020-02-07 | 112.299 | 57.19 |
| 2020-02-06 | 113.498 | 57.8 |
| 2020-02-05 | 114.636 | 58.38 |
| 2020-02-04 | 115.839 | 58.99 |
| 2020-02-03 | 116.821 | 59.49 |
| 2020-02-02 | 117.798 | 59.99 |
| 2020-02-01 | 118.46 | 60.32 |
| 2020-01-31 | 119.396 | 60.8 |
| 2020-01-30 | 120.565 | 61.39 |
| 2020-01-29 | 121.904 | 62.08 |
| 2020-01-28 | 123.15 | 62.71 |
| 2020-01-27 | 124.346 | 63.32 |
| 2020-01-26 | 125.695 | 64.01 |
| 2020-01-25 | 126.855 | 64.6 |
| 2020-01-24 | 128.189 | 65.28 |
| 2020-01-23 | 129.553 | 65.97 |
| 2020-01-22 | 130.905 | 66.66 |
| 2020-01-21 | 132.242 | 67.34 |
| 2020-01-20 | 133.597 | 68.03 |
| 2020-01-19 | 134.953 | 68.72 |
| 2020-01-18 | 136.229 | 69.37 |
| 2020-01-17 | 137.56 | 70.05 |
| 2020-01-16 | 138.918 | 70.74 |
| 2020-01-15 | 140.272 | 71.43 |
| 2020-01-14 | 141.542 | 72.08 |
| 2020-01-13 | 142.825 | 72.73 |
| 2020-01-12 | 144.095 | 73.38 |
| 2020-01-11 | 145.25 | 73.96 |
| 2020-01-10 | 146.43 | 74.57 |
| 2020-01-09 | 147.711 | 75.22 |
| 2020-01-08 | 148.989 | 75.87 |
| 2020-01-07 | 150.269 | 76.52 |
| 2020-01-06 | 151.54 | 77.17 |
| 2020-01-05 | 152.783 | 77.8 |
| 2020-01-04 | 153.801 | 78.32 |
| 2020-01-03 | 154.962 | 78.91 |
| 2020-01-02 | 156.144 | 79.51 |
| 2020-01-01 | 157.264 | 80.08 |
| 2019-12-31 | 158.247 | 80.58 |
| 2019-12-30 | 159.236 | 81.09 |
| 2019-12-29 | 160.215 | 81.59 |
| 2019-12-28 | 161.038 | 82 |
| 2019-12-27 | 161.795 | 82.39 |
| 2019-12-26 | 162.484 | 82.74 |
| 2019-12-25 | 162.824 | 82.91 |
| 2019-12-24 | 163.099 | 83.05 |
| 2019-12-23 | 163.651 | 83.33 |
| 2019-12-22 | 164.302 | 83.67 |
| 2019-12-21 | 164.7 | 83.87 |
| 2019-12-20 | 165.038 | 84.04 |
| 2019-12-19 | 165.794 | 84.43 |
| 2019-12-18 | 166.634 | 84.85 |
| 2019-12-17 | 167.504 | 85.3 |
| 2019-12-16 | 168.461 | 85.78 |
| 2019-12-15 | 169.468 | 86.3 |
| 2019-12-14 | 170.258 | 86.7 |
| 2019-12-13 | 171.148 | 87.15 |
| 2019-12-12 | 172.168 | 87.67 |
| 2019-12-11 | 173.213 | 88.2 |
| 2019-12-10 | 174.224 | 88.72 |
| 2019-12-09 | 175.228 | 89.23 |
| 2019-12-08 | 176.172 | 89.71 |
| 2019-12-07 | 176.739 | 90 |
| 2019-12-06 | 177.642 | 90.46 |
| 2019-12-05 | 178.66 | 90.98 |
| 2019-12-04 | 179.667 | 91.49 |
| 2019-12-03 | 180.675 | 92 |
| 2019-12-02 | 181.602 | 92.48 |
| 2019-12-01 | 182.497 | 92.93 |
| 2019-11-30 | 182.986 | 93.18 |
| 2019-11-29 | 183.21 | 93.29 |
| 2019-11-28 | 183.697 | 93.54 |
| 2019-11-27 | 184.128 | 93.76 |
| 2019-11-26 | 184.775 | 94.09 |
| 2019-11-25 | 185.392 | 94.41 |
| 2019-11-24 | 186.032 | 94.73 |
| 2019-11-23 | 186.262 | 94.85 |
| 2019-11-22 | 186.639 | 95.04 |
| 2019-11-21 | 187.252 | 95.35 |
| 2019-11-20 | 187.926 | 95.7 |
| 2019-11-19 | 188.629 | 96.05 |
| 2019-11-18 | 189.465 | 96.48 |
| 2019-11-17 | 190.211 | 96.86 |
| 2019-11-16 | 190.579 | 97.05 |
| 2019-11-15 | 190.949 | 97.24 |
| 2019-11-14 | 191.507 | 97.52 |
| 2019-11-13 | 192.214 | 97.88 |
| 2019-11-12 | 192.899 | 98.23 |
| 2019-11-11 | 193.438 | 98.5 |
| 2019-11-10 | 193.897 | 98.74 |
| 2019-11-09 | 193.903 | 98.74 |
| 2019-11-08 | 193.942 | 98.76 |
| 2019-11-07 | 194.023 | 98.8 |
| 2019-11-06 | 194.157 | 98.87 |
| 2019-11-05 | 194.306 | 98.95 |
| 2019-11-04 | 194.382 | 98.98 |
| 2019-11-03 | 194.395 | 98.99 |
| 2019-11-02 | 194.346 | 98.97 |
| 2019-11-01 | 194.304 | 98.94 |
| 2019-10-31 | 194.251 | 98.92 |
| 2019-10-30 | 194.139 | 98.86 |
| 2019-10-29 | 194.019 | 98.8 |
| 2019-10-28 | 193.906 | 98.74 |
| 2019-10-27 | 193.51 | 98.54 |
| 2019-10-26 | 193.375 | 98.47 |
| 2019-10-25 | 193.241 | 98.4 |
| 2019-10-24 | 193.116 | 98.34 |
| 2019-10-23 | 192.749 | 98.15 |
| 2019-10-22 | 192.877 | 98.22 |
| 2019-10-21 | 192.762 | 98.16 |
| 2019-10-20 | 192.666 | 98.11 |
| 2019-10-19 | 192.533 | 98.04 |
| 2019-10-18 | 192.412 | 97.98 |
| 2019-10-17 | 192.298 | 97.92 |
| 2019-10-16 | 192.208 | 97.88 |
| 2019-10-15 | 192.115 | 97.83 |
| 2019-10-14 | 192 | 97.77 |
| 2019-10-13 | 191.89 | 97.71 |
| 2019-10-12 | 191.754 | 97.65 |
| 2019-10-11 | 191.621 | 97.58 |
| 2019-10-10 | 191.501 | 97.52 |
| 2019-10-09 | 191.392 | 97.46 |
| 2019-10-08 | 191.28 | 97.4 |
| 2019-10-07 | 191.146 | 97.34 |
| 2019-10-06 | 191.047 | 97.29 |
| 2019-10-05 | 190.916 | 97.22 |
| 2019-10-04 | 190.786 | 97.15 |
| 2019-10-03 | 190.72 | 97.12 |
| 2019-10-02 | 190.586 | 97.05 |
| 2019-10-01 | 190.473 | 96.99 |
| 2019-09-30 | 190.345 | 96.93 |
| 2019-09-29 | 190.185 | 96.85 |
| 2019-09-28 | 189.803 | 96.65 |
| 2019-09-27 | 189.421 | 96.46 |
| 2019-09-26 | 189.074 | 96.28 |
| 2019-09-25 | 188.708 | 96.09 |
| 2019-09-24 | 188.34 | 95.91 |
| 2019-09-23 | 187.663 | 95.56 |
| 2019-09-22 | 187.276 | 95.37 |
| 2019-09-21 | 186.925 | 95.19 |
| 2019-09-20 | 186.581 | 95.01 |
| 2019-09-19 | 186.229 | 94.83 |
| 2019-09-18 | 185.896 | 94.66 |
| 2019-09-17 | 185.549 | 94.49 |
| 2019-09-16 | 185.195 | 94.31 |
| 2019-09-15 | 184.273 | 93.84 |
| 2019-09-14 | 183.875 | 93.63 |
| 2019-09-13 | 183.478 | 93.43 |
| 2019-09-12 | 183.089 | 93.23 |
| 2019-09-11 | 182.709 | 93.04 |
| 2019-09-10 | 182.329 | 92.85 |
| 2019-09-09 | 181.925 | 92.64 |
| 2019-09-08 | 181.528 | 92.44 |
| 2019-09-07 | 181.106 | 92.22 |
| 2019-09-06 | 180.682 | 92.01 |
| 2019-09-05 | 180.272 | 91.8 |
| 2019-09-04 | 179.841 | 91.58 |
| 2019-09-03 | 179.45 | 91.38 |
| 2019-09-02 | 179.056 | 91.18 |
| 2019-09-01 | 178.714 | 91.01 |
| 2019-08-31 | 178.217 | 90.75 |
| 2019-08-30 | 177.726 | 90.5 |
| 2019-08-29 | 177.241 | 90.26 |
| 2019-08-28 | 176.788 | 90.02 |
| 2019-08-27 | 176.327 | 89.79 |
| 2019-08-26 | 175.881 | 89.56 |
| 2019-08-25 | 175.348 | 89.29 |
| 2019-08-24 | 174.805 | 89.01 |
| 2019-08-23 | 174.26 | 88.74 |
| 2019-08-22 | 173.713 | 88.46 |
| 2019-08-21 | 173.164 | 88.18 |
| 2019-08-20 | 172.613 | 87.9 |
| 2019-08-19 | 172.061 | 87.62 |
| 2019-08-18 | 171.511 | 87.34 |
| 2019-08-17 | 170.156 | 86.65 |
| 2019-08-16 | 169.585 | 86.36 |
| 2019-08-15 | 169.002 | 86.06 |
| 2019-08-14 | 168.423 | 85.76 |
| 2019-08-13 | 167.862 | 85.48 |
| 2019-08-12 | 167.32 | 85.2 |
| 2019-08-11 | 166.766 | 84.92 |
| 2019-08-10 | 166.194 | 84.63 |
| 2019-08-09 | 165.623 | 84.34 |
| 2019-08-08 | 165.045 | 84.04 |
| 2019-08-07 | 164.458 | 83.75 |
| 2019-08-06 | 163.886 | 83.45 |
| 2019-08-05 | 163.319 | 83.17 |
| 2019-08-04 | 162.742 | 82.87 |
| 2019-08-03 | 162.112 | 82.55 |
| 2019-08-02 | 161.396 | 82.19 |
| 2019-08-01 | 160.663 | 81.81 |
| 2019-07-31 | 159.973 | 81.46 |
| 2019-07-30 | 159.297 | 81.12 |
| 2019-07-29 | 158.576 | 80.75 |
| 2019-07-28 | 157.964 | 80.44 |
| 2019-07-27 | 157.255 | 80.08 |
| 2019-07-26 | 156.62 | 79.75 |
| 2019-07-25 | 156.052 | 79.47 |
| 2019-07-24 | 155.418 | 79.14 |
| 2019-07-23 | 154.791 | 78.82 |
| 2019-07-22 | 154.108 | 78.48 |
| 2019-07-21 | 153.472 | 78.15 |
| 2019-07-20 | 152.782 | 77.8 |
| 2019-07-19 | 152.121 | 77.46 |
| 2019-07-18 | 151.462 | 77.13 |
| 2019-07-17 | 150.771 | 76.78 |
| 2019-07-16 | 150.081 | 76.42 |
| 2019-07-15 | 149.411 | 76.08 |
| 2019-07-14 | 148.747 | 75.75 |
| 2019-07-13 | 148.074 | 75.4 |
| 2019-07-12 | 147.406 | 75.06 |
| 2019-07-11 | 146.681 | 74.69 |
| 2019-07-10 | 145.961 | 74.33 |
| 2019-07-09 | 145.262 | 73.97 |
| 2019-07-08 | 144.69 | 73.68 |
| 2019-07-07 | 143.877 | 73.27 |
| 2019-07-06 | 143.149 | 72.89 |
| 2019-07-05 | 142.407 | 72.52 |
| 2019-07-04 | 141.792 | 72.2 |
| 2019-07-03 | 141.365 | 71.99 |
| 2019-07-02 | 140.866 | 71.73 |
| 2019-07-01 | 140.563 | 71.58 |
| 2019-06-30 | 139.909 | 71.24 |
| 2019-06-29 | 139.059 | 70.81 |
| 2019-06-28 | 138.255 | 70.4 |
| 2019-06-27 | 137.602 | 70.07 |
| 2019-06-26 | 136.914 | 69.72 |
| 2019-06-25 | 136.207 | 69.36 |
| 2019-06-24 | 135.444 | 68.97 |
| 2019-06-23 | 134.624 | 68.55 |
| 2019-06-22 | 133.753 | 68.11 |
| 2019-06-21 | 132.99 | 67.72 |
| 2019-06-20 | 132.223 | 67.33 |
| 2019-06-19 | 131.401 | 66.91 |
| 2019-06-18 | 130.818 | 66.62 |
| 2019-06-17 | 130.176 | 66.29 |
| 2019-06-16 | 129.304 | 65.84 |
| 2019-06-15 | 128.413 | 65.39 |
| 2019-06-14 | 127.554 | 64.95 |
| 2019-06-13 | 126.667 | 64.5 |
| 2019-06-12 | 125.86 | 64.09 |
| 2019-06-11 | 125.042 | 63.67 |
| 2019-06-10 | 124.162 | 63.23 |
| 2019-06-09 | 123.448 | 62.86 |
| 2019-06-08 | 122.541 | 62.4 |
| 2019-06-07 | 121.531 | 61.89 |
| 2019-06-06 | 120.581 | 61.4 |
| 2019-06-05 | 119.626 | 60.92 |
| 2019-06-04 | 118.808 | 60.5 |
| 2019-06-03 | 118.099 | 60.14 |
| 2019-06-02 | 117.351 | 59.76 |
| 2019-06-01 | 116.356 | 59.25 |
| 2019-05-31 | 115.421 | 58.78 |
| 2019-05-30 | 114.402 | 58.26 |
| 2019-05-29 | 113.492 | 57.79 |
| 2019-05-28 | 112.582 | 57.33 |
| 2019-05-27 | 111.715 | 56.89 |
| 2019-05-26 | 110.819 | 56.43 |
| 2019-05-25 | 109.776 | 55.9 |
| 2019-05-24 | 108.802 | 55.4 |
| 2019-05-23 | 107.883 | 54.94 |
| 2019-05-22 | 107.018 | 54.5 |
| 2019-05-21 | 106.132 | 54.04 |
| 2019-05-20 | 105.369 | 53.66 |
| 2019-05-19 | 104.619 | 53.27 |
| 2019-05-18 | 103.764 | 52.84 |
| 2019-05-17 | 102.91 | 52.4 |
| 2019-05-16 | 102.131 | 52.01 |
| 2019-05-15 | 101.534 | 51.7 |
| 2019-05-14 | 101.056 | 51.46 |
| 2019-05-13 | 100.5 | 51.18 |
| 2019-05-12 | 99.942 | 50.89 |
| 2019-05-11 | 99.001 | 50.41 |
| 2019-05-10 | 98.055 | 49.93 |
| 2019-05-09 | 97.303 | 49.55 |
| 2019-05-08 | 96.676 | 49.23 |
| 2019-05-07 | 96.27 | 49.02 |
| 2019-05-06 | 95.834 | 48.8 |
| 2019-05-05 | 95.376 | 48.57 |
| 2019-05-04 | 94.65 | 48.2 |
| 2019-05-03 | 93.859 | 47.8 |
| 2019-05-02 | 93.074 | 47.4 |
| 2019-05-01 | 92.441 | 47.07 |
| 2019-04-30 | 91.691 | 46.69 |
| 2019-04-29 | 90.967 | 46.32 |
| 2019-04-28 | 90.436 | 46.05 |
| 2019-04-27 | 89.634 | 45.64 |
| 2019-04-26 | 88.756 | 45.2 |
| 2019-04-25 | 87.851 | 44.74 |
| 2019-04-24 | 86.87 | 44.24 |
| 2019-04-23 | 86.074 | 43.83 |
| 2019-04-22 | 85.336 | 43.46 |
| 2019-04-21 | 84.415 | 42.99 |
| 2019-04-20 | 83.484 | 42.51 |
| 2019-04-19 | 82.579 | 42.05 |
| 2019-04-18 | 81.785 | 41.65 |
| 2019-04-17 | 81.049 | 41.27 |
| 2019-04-16 | 80.492 | 40.99 |
| 2019-04-15 | 80.049 | 40.76 |
| 2019-04-14 | 79.697 | 40.58 |
| 2019-04-13 | 79.172 | 40.32 |
| 2019-04-12 | 78.67 | 40.06 |
| 2019-04-11 | 78.393 | 53.12 |
| 2019-04-10 | 78.116 | 52.94 |
| 2019-04-09 | 77.755 | 52.69 |
| 2019-04-08 | 77.491 | 52.51 |
| 2019-04-07 | 77.32 | 52.4 |
| 2019-04-06 | 76.806 | 52.05 |
| 2019-04-05 | 76.266 | 51.68 |
| 2019-04-04 | 76.068 | 51.55 |
| 2019-04-03 | 75.885 | 51.42 |
| 2019-04-02 | 75.649 | 51.26 |
| 2019-04-01 | 75.268 | 51.01 |
| 2019-03-31 | 74.557 | 38.29 |
| 2019-03-30 | 74.51 | 38.27 |
| 2019-03-29 | 74.464 | 38.24 |
| 2019-03-28 | 74.442 | 38.23 |
| 2019-03-27 | 74.638 | 38.33 |
| 2019-03-26 | 74.856 | 38.44 |
| 2019-03-25 | 75.064 | 38.55 |
| 2019-03-24 | 73.199 | 37.59 |
| 2019-03-23 | 74.935 | 38.48 |
| 2019-03-22 | 74.783 | 38.41 |
| 2019-03-21 | 74.848 | 38.44 |
| 2019-03-20 | 75.2 | 38.62 |
| 2019-03-19 | 75.678 | 38.87 |
| 2019-03-18 | 76.261 | 39.17 |
| 2019-03-17 | 76.482 | 39.28 |
| 2019-03-16 | 76.428 | 39.25 |
| 2019-03-15 | 76.348 | 39.21 |
| 2019-03-14 | 76.555 | 39.32 |
| 2019-03-13 | 77.179 | 39.64 |
| 2019-03-12 | 77.746 | 39.93 |
| 2019-03-11 | 78.1 | 40.11 |
| 2019-03-10 | 78.223 | 40.17 |
| 2019-03-09 | 78.092 | 40.11 |
| 2019-03-08 | 78.078 | 40.1 |
| 2019-03-07 | 78.246 | 40.18 |
| 2019-03-06 | 78.648 | 40.39 |
| 2019-03-05 | 79.19 | 40.67 |
| 2019-03-04 | 79.665 | 40.91 |
| 2019-03-03 | 80.162 | 41.17 |
| 2019-03-02 | 80.335 | 41.26 |
| 2019-03-01 | 80.567 | 41.38 |
| 2019-02-28 | 80.993 | 41.6 |
| 2019-02-27 | 81.7 | 41.96 |
| 2019-02-26 | 82.412 | 42.32 |
| 2019-02-25 | 83.378 | 42.82 |
| 2019-02-24 | 84.451 | 43.37 |
| 2019-02-23 | 85.453 | 43.89 |
| 2019-02-22 | 86.335 | 44.34 |
| 2019-02-21 | 87.351 | 44.86 |
| 2019-02-20 | 88.35 | 45.37 |
| 2019-02-19 | 89.382 | 45.9 |
| 2019-02-18 | 90.386 | 46.42 |
| 2019-02-17 | 91.352 | 46.92 |
| 2019-02-16 | 92.091 | 47.3 |
| 2019-02-15 | 93.044 | 47.78 |
| 2019-02-14 | 94.03 | 48.29 |
| 2019-02-13 | 95.142 | 48.86 |
| 2019-02-12 | 96.255 | 49.43 |
| 2019-02-11 | 97.198 | 49.92 |
| 2019-02-10 | 98.329 | 50.5 |
| 2019-02-09 | 99.057 | 50.87 |
| 2019-02-08 | 99.964 | 51.34 |
| 2019-02-07 | 101.106 | 51.93 |
| 2019-02-06 | 102.215 | 52.49 |
| 2019-02-05 | 103.272 | 53.04 |
| 2019-02-04 | 104.371 | 53.6 |
| 2019-02-03 | 105.469 | 54.17 |
| 2019-02-02 | 106.291 | 54.59 |
| 2019-02-01 | 107.228 | 55.07 |
| 2019-01-31 | 108.318 | 55.63 |
| 2019-01-30 | 109.587 | 56.28 |
| 2019-01-29 | 110.875 | 56.94 |
| 2019-01-28 | 112.137 | 57.59 |
| 2019-01-27 | 113.423 | 58.25 |
| 2019-01-26 | 114.577 | 58.84 |
| 2019-01-25 | 115.823 | 59.48 |
| 2019-01-24 | 117.106 | 60.14 |
| 2019-01-23 | 118.395 | 60.8 |
| 2019-01-22 | 119.665 | 61.46 |
| 2019-01-21 | 120.946 | 62.11 |
| 2019-01-20 | 122.209 | 62.76 |
| 2019-01-19 | 123.387 | 63.37 |
| 2019-01-18 | 124.551 | 63.97 |
| 2019-01-17 | 125.826 | 64.62 |
| 2019-01-16 | 127.056 | 65.25 |
| 2019-01-15 | 128.326 | 65.9 |
| 2019-01-14 | 133.897 | 68.77 |
| 2019-01-13 | 133.992 | 68.81 |
| 2019-01-12 | 134.041 | 68.84 |
| 2019-01-11 | 134.116 | 68.88 |
| 2019-01-10 | 134.213 | 68.93 |
| 2019-01-09 | 135.436 | 69.56 |
| 2019-01-08 | 136.684 | 70.2 |
| 2019-01-07 | 137.932 | 70.84 |
| 2019-01-06 | 139.158 | 71.47 |
| 2019-01-05 | 140.373 | 72.09 |
| 2019-01-04 | 141.587 | 72.71 |
| 2019-01-03 | 142.797 | 73.34 |
| 2019-01-02 | 143.982 | 73.95 |
| 2019-01-01 | 144.462 | 74.19 |
| 2018-12-31 | 145.196 | 74.57 |
| 2018-12-30 | 146.071 | 75.02 |
| 2018-12-29 | 146.891 | 75.44 |
| 2018-12-28 | 147.769 | 75.97 |
| 2018-12-27 | 148.728 | 76.46 |
| 2018-12-26 | 149.706 | 76.96 |
| 2018-12-25 | 150.539 | 77.39 |
| 2018-12-24 | 151.12 | 77.69 |
| 2018-12-23 | 151.705 | 77.99 |
| 2018-12-22 | 152.44 | 78.37 |
| 2018-12-21 | 153.221 | 78.77 |
| 2018-12-20 | 154.122 | 79.23 |
| 2018-12-19 | 155.108 | 79.74 |
| 2018-12-18 | 156.174 | 80.29 |
| 2018-12-17 | 157.221 | 80.82 |
| 2018-12-16 | 158.28 | 81.37 |
| 2018-12-15 | 159.286 | 81.89 |
| 2018-12-14 | 160.407 | 82.46 |
| 2018-12-13 | 161.656 | 83.1 |
| 2018-12-12 | 162.9 | 83.74 |
| 2018-12-11 | 163.952 | 84.29 |
| 2018-12-10 | 165.006 | 84.83 |
| 2018-12-09 | 165.994 | 85.33 |
| 2018-12-08 | 166.532 | 85.61 |
| 2018-12-07 | 167.082 | 85.89 |
| 2018-12-06 | 168.064 | 86.4 |
| 2018-12-05 | 169.017 | 86.89 |
| 2018-12-04 | 169.997 | 87.39 |
| 2018-12-03 | 170.924 | 87.87 |
| 2018-12-02 | 171.93 | 88.39 |
| 2018-12-01 | 172.474 | 88.67 |
| 2018-11-30 | 173.363 | 89.12 |
| 2018-11-29 | 174.218 | 89.56 |
| 2018-11-28 | 175.14 | 90.04 |
| 2018-11-27 | 175.923 | 90.44 |
| 2018-11-26 | 176.728 | 90.85 |
| 2018-11-25 | 177.492 | 91.25 |
| 2018-11-24 | 178.012 | 91.51 |
| 2018-11-23 | 178.645 | 91.84 |
| 2018-11-22 | 179.514 | 92.29 |
| 2018-11-21 | 180.341 | 92.71 |
| 2018-11-20 | 181.303 | 93.21 |
| 2018-11-19 | 182.258 | 93.7 |
| 2018-11-18 | 183.19 | 94.18 |
| 2018-11-17 | 183.888 | 94.53 |
| 2018-11-16 | 184.568 | 94.88 |
| 2018-11-15 | 185.28 | 95.25 |
| 2018-11-14 | 185.941 | 95.59 |
| 2018-11-13 | 186.45 | 95.85 |
| 2018-11-12 | 186.962 | 96.11 |
| 2018-11-11 | 187.423 | 96.35 |
| 2018-11-10 | 187.577 | 96.43 |
| 2018-11-09 | 187.86 | 96.58 |
| 2018-11-08 | 187.895 | 96.59 |
| 2018-11-07 | 188.309 | 96.81 |
| 2018-11-06 | 188.699 | 97.01 |
| 2018-11-05 | 189.021 | 97.17 |
| 2018-11-04 | 189.053 | 97.19 |
| 2018-11-03 | 189.239 | 97.28 |
| 2018-11-02 | 189.431 | 97.38 |
| 2018-11-01 | 189.344 | 97.34 |
| 2018-10-31 | 189.578 | 97.46 |
| 2018-10-30 | 189.81 | 97.58 |
| 2018-10-29 | 190.044 | 97.7 |
| 2018-10-28 | 189.89 | 97.62 |
| 2018-10-27 | 189.839 | 97.59 |
| 2018-10-26 | 189.785 | 97.57 |
| 2018-10-25 | 189.741 | 97.54 |
| 2018-10-24 | 189.694 | 97.52 |
| 2018-10-23 | 189.659 | 97.5 |
| 2018-10-22 | 189.659 | 97.5 |
| 2018-10-21 | 189.617 | 97.48 |
| 2018-10-20 | 189.452 | 97.39 |
| 2018-10-19 | 189.262 | 97.3 |
| 2018-10-18 | 189.134 | 97.23 |
| 2018-10-17 | 188.983 | 97.15 |
| 2018-10-16 | 188.909 | 97.11 |
| 2018-10-15 | 188.816 | 97.07 |
| 2018-10-14 | 188.643 | 96.98 |
| 2018-10-13 | 188.248 | 96.78 |
| 2018-10-12 | 187.833 | 96.56 |
| 2018-10-11 | 187.626 | 96.46 |
| 2018-10-10 | 187.474 | 96.38 |
| 2018-10-09 | 187.307 | 96.29 |
| 2018-10-08 | 187.153 | 96.21 |
| 2018-10-07 | 186.966 | 96.12 |
| 2018-10-06 | 186.589 | 95.92 |
| 2018-10-05 | 186.302 | 95.77 |
| 2018-10-04 | 186.17 | 95.71 |
| 2018-10-03 | 186.034 | 95.64 |
| 2018-10-02 | 185.915 | 95.58 |
| 2018-10-01 | 185.833 | 95.53 |
| 2018-09-30 | 185.558 | 95.39 |
| 2018-09-29 | 185.111 | 95.16 |
| 2018-09-28 | 184.729 | 94.97 |
| 2018-09-27 | 184.496 | 94.85 |
| 2018-09-26 | 184.197 | 94.69 |
| 2018-09-25 | 183.998 | 94.59 |
| 2018-09-24 | 183.794 | 94.49 |
| 2018-09-23 | 183.444 | 94.31 |
| 2018-09-22 | 183.052 | 94.1 |
| 2018-09-21 | 182.733 | 93.94 |
| 2018-09-20 | 182.276 | 93.71 |
| 2018-09-19 | 181.89 | 93.51 |
| 2018-09-18 | 181.39 | 93.25 |
| 2018-09-17 | 180.99 | 93.04 |
| 2018-09-16 | 180.636 | 92.86 |
| 2018-09-15 | 180.187 | 92.63 |
| 2018-09-14 | 179.784 | 92.42 |
| 2018-09-13 | 179.362 | 92.21 |
| 2018-09-12 | 179.042 | 92.04 |
| 2018-09-11 | 178.692 | 91.86 |
| 2018-09-10 | 178.237 | 91.63 |
| 2018-09-09 | 177.726 | 91.37 |
| 2018-09-08 | 177.161 | 91.08 |
| 2018-09-07 | 176.612 | 90.79 |
| 2018-09-06 | 176.072 | 90.52 |
| 2018-09-05 | 175.582 | 90.26 |
| 2018-09-04 | 175.07 | 90 |
| 2018-09-03 | 174.584 | 89.75 |
| 2018-09-02 | 174.094 | 89.5 |
| 2018-09-01 | 173.491 | 89.19 |
| 2018-08-31 | 172.868 | 88.87 |
| 2018-08-30 | 172.266 | 88.56 |
| 2018-08-29 | 171.717 | 88.28 |
| 2018-08-28 | 171.229 | 88.03 |
| 2018-08-27 | 170.656 | 87.73 |
| 2018-08-26 | 170.067 | 87.43 |
| 2018-08-25 | 169.461 | 87.12 |
| 2018-08-24 | 168.328 | 86.53 |
| 2018-08-23 | 168.275 | 86.51 |
| 2018-08-22 | 167.662 | 86.19 |
| 2018-08-21 | 167.028 | 85.87 |
| 2018-08-20 | 166.399 | 85.54 |
| 2018-08-19 | 165.758 | 85.21 |
| 2018-08-18 | 165.11 | 84.88 |
| 2018-08-17 | 164.448 | 84.54 |
| 2018-08-16 | 163.727 | 84.17 |
| 2018-08-15 | 163.019 | 83.81 |
| 2018-08-14 | 162.3 | 83.44 |
| 2018-08-13 | 161.577 | 83.06 |
| 2018-08-12 | 160.97 | 82.75 |
| 2018-08-11 | 160.31 | 82.41 |
| 2018-08-10 | 159.688 | 82.09 |
| 2018-08-09 | 159.051 | 81.77 |
| 2018-08-08 | 158.596 | 81.53 |
| 2018-08-07 | 158.31 | 81.38 |
| 2018-08-06 | 158.111 | 81.28 |
| 2018-08-05 | 157.881 | 81.16 |
| 2018-08-04 | 157.246 | 80.84 |
| 2018-08-03 | 156.64 | 80.53 |
| 2018-08-02 | 156.001 | 80.2 |
| 2018-08-01 | 155.531 | 79.96 |
| 2018-07-31 | 155.137 | 79.75 |
| 2018-07-30 | 154.566 | 79.46 |
| 2018-07-29 | 153.851 | 79.09 |
| 2018-07-28 | 153.069 | 78.69 |
| 2018-07-27 | 152.277 | 78.28 |
| 2018-07-26 | 151.551 | 77.91 |
| 2018-07-25 | 150.955 | 77.6 |
| 2018-07-24 | 150.308 | 77.27 |
| 2018-07-23 | 149.632 | 76.92 |
| 2018-07-22 | 148.869 | 76.53 |
| 2018-07-21 | 147.972 | 76.07 |
| 2018-07-20 | 147.078 | 75.61 |
| 2018-07-19 | 146.388 | 75.26 |
| 2018-07-18 | 145.737 | 74.92 |
| 2018-07-17 | 145.076 | 74.58 |
| 2018-07-16 | 144.449 | 74.26 |
| 2018-07-15 | 143.825 | 73.94 |
| 2018-07-14 | 143.019 | 73.52 |
| 2018-07-13 | 142.207 | 73.11 |
| 2018-07-12 | 141.788 | 72.89 |
| 2018-07-11 | 141.399 | 72.69 |
| 2018-07-10 | 141.074 | 72.52 |
| 2018-07-09 | 141.594 | 72.79 |
| 2018-07-08 | 141.14 | 72.56 |
| 2018-07-07 | 140.301 | 72.13 |
| 2018-07-06 | 139.272 | 71.6 |
| 2018-07-05 | 138.614 | 71.26 |
| 2018-07-04 | 138.076 | 70.98 |
| 2018-07-03 | 136.843 | 70.35 |
| 2018-07-02 | 136.407 | 70.12 |
| 2018-07-01 | 135.792 | 69.81 |
| 2018-06-30 | 134.831 | 69.31 |
| 2018-06-29 | 133.936 | 68.85 |
| 2018-06-28 | 133.166 | 68.46 |
| 2018-06-27 | 132.359 | 68.04 |
| 2018-06-26 | 131.595 | 67.65 |
| 2018-06-25 | 130.894 | 67.29 |
| 2018-06-24 | 130.108 | 66.89 |
| 2018-06-23 | 129.144 | 66.39 |
| 2018-06-22 | 128.13 | 65.87 |
| 2018-06-21 | 127.47 | 65.53 |
| 2018-06-20 | 127.023 | 65.3 |
| 2018-06-19 | 126.538 | 65.05 |
| 2018-06-18 | 125.995 | 64.77 |
| 2018-06-17 | 125.365 | 64.45 |
| 2018-06-16 | 124.459 | 63.98 |
| 2018-06-15 | 123.522 | 63.5 |
| 2018-06-14 | 122.811 | 63.13 |
| 2018-06-13 | 122.025 | 62.73 |
| 2018-06-12 | 121.29 | 62.35 |
| 2018-06-11 | 120.63 | 62.01 |
| 2018-06-10 | 119.957 | 61.67 |
| 2018-06-09 | 118.995 | 61.17 |
| 2018-06-08 | 118.053 | 60.69 |
| 2018-06-07 | 117.295 | 60.3 |
| 2018-06-06 | 116.549 | 59.92 |
| 2018-06-05 | 115.873 | 59.57 |
| 2018-06-04 | 115.182 | 59.21 |
| 2018-06-03 | 114.527 | 58.88 |
| 2018-06-02 | 113.647 | 58.42 |
| 2018-06-01 | 112.704 | 57.94 |
| 2018-05-31 | 111.827 | 57.49 |
| 2018-05-30 | 110.967 | 57.05 |
| 2018-05-29 | 110.1 | 56.6 |
| 2018-05-28 | 109.166 | 56.12 |
| 2018-05-27 | 108.346 | 55.7 |
| 2018-05-26 | 107.307 | 55.16 |
| 2018-05-25 | 106.266 | 54.63 |
| 2018-05-24 | 105.374 | 54.17 |
| 2018-05-23 | 104.586 | 53.77 |
| 2018-05-22 | 103.983 | 53.46 |
| 2018-05-21 | 103.348 | 53.13 |
| 2018-05-20 | 102.546 | 52.72 |
| 2018-05-19 | 101.4 | 52.13 |
| 2018-05-18 | 100.243 | 51.53 |
| 2018-05-17 | 99.354 | 51.08 |
| 2018-05-16 | 98.397 | 50.58 |
| 2018-05-15 | 97.394 | 50.07 |
| 2018-05-14 | 96.45 | 49.58 |
| 2018-05-13 | 94.45 | 48.55 |
| 2018-05-12 | 94.394 | 48.53 |
| 2018-05-11 | 93.343 | 47.99 |
| 2018-05-10 | 92.396 | 47.5 |
| 2018-05-09 | 91.518 | 47.05 |
| 2018-05-08 | 90.624 | 46.59 |
| 2018-05-07 | 89.786 | 46.16 |
| 2018-05-06 | 88.981 | 45.74 |
| 2018-05-05 | 87.946 | 45.21 |
| 2018-05-04 | 86.98 | 44.72 |
| 2018-05-03 | 86.257 | 44.34 |
| 2018-05-02 | 85.643 | 44.03 |
| 2018-05-01 | 84.994 | 43.69 |
| 2018-04-30 | 83.956 | 43.16 |
| 2018-04-29 | 83.076 | 42.71 |
| 2018-04-28 | 81.993 | 42.15 |
| 2018-04-27 | 80.922 | 41.6 |
| 2018-04-26 | 80.023 | 41.14 |
| 2018-04-25 | 79.298 | 40.77 |
| 2018-04-24 | 78.464 | 40.34 |
| 2018-04-23 | 77.93 | 40.06 |
| 2018-04-22 | 77.11 | 39.64 |
| 2018-04-21 | 76.1 | 39.12 |
| 2018-04-20 | 75.102 | 38.61 |
| 2018-04-19 | 74.12 | 38.1 |
| 2018-04-18 | 73.496 | 37.78 |
| 2018-04-17 | 72.836 | 37.44 |
| 2018-04-16 | 72.376 | 37.21 |
| 2018-04-15 | 71.83 | 36.93 |
| 2018-04-14 | 71.047 | 36.52 |
| 2018-04-13 | 70.256 | 36.12 |
| 2018-04-12 | 69.873 | 35.92 |
| 2018-04-11 | 69.696 | 35.83 |
| 2018-04-10 | 69.491 | 35.72 |
| 2018-04-09 | 69.258 | 35.6 |
| 2018-04-08 | 68.911 | 47.32 |
| 2018-04-07 | 68.091 | 46.76 |
| 2018-04-06 | 67.414 | 46.29 |
| 2018-04-05 | 67.02 | 46.02 |
| 2018-04-04 | 66.878 | 45.92 |
| 2018-04-03 | 66.868 | 45.92 |
| 2018-04-02 | 66.773 | 45.85 |
| 2018-04-01 | 66.42 | 45.61 |
| 2018-03-31 | 64.33 | 44.18 |
| 2018-03-30 | 64.835 | 33.6 |
| 2018-03-29 | 64.607 | 33.49 |
| 2018-03-28 | 64.587 | 33.48 |
| 2018-03-27 | 64.835 | 33.6 |
| 2018-03-26 | 65.258 | 33.82 |
| 2018-03-25 | 65.756 | 34.08 |
| 2018-03-24 | 65.894 | 34.15 |
| 2018-03-23 | 66.233 | 34.33 |
| 2018-03-22 | 66.805 | 34.62 |
| 2018-03-21 | 67.438 | 34.95 |
| 2018-03-20 | 68.102 | 35.3 |
| 2018-03-19 | 68.768 | 35.64 |
| 2018-03-18 | 69.43 | 35.99 |
| 2018-03-17 | 69.757 | 36.16 |
| 2018-03-16 | 70.12 | 36.34 |
| 2018-03-15 | 70.687 | 36.64 |
| 2018-03-14 | 71.486 | 37.05 |
| 2018-03-13 | 72.133 | 37.39 |
| 2018-03-12 | 72.67 | 37.66 |
| 2018-03-11 | 73.292 | 37.99 |
| 2018-03-10 | 73.562 | 38.13 |
| 2018-03-09 | 73.877 | 38.29 |
| 2018-03-08 | 74.482 | 38.6 |
| 2018-03-07 | 75.171 | 38.96 |
| 2018-03-06 | 75.917 | 39.35 |
| 2018-03-05 | 76.656 | 39.73 |
| 2018-03-04 | 77.402 | 40.12 |
| 2018-03-03 | 78.207 | 40.53 |
| 2018-03-02 | 79.02 | 40.96 |
| 2018-03-01 | 79.958 | 41.44 |
| 2018-02-28 | 81.094 | 42.03 |
| 2018-02-27 | 82.226 | 42.62 |
| 2018-02-26 | 83.354 | 43.2 |
| 2018-02-25 | 84.485 | 43.79 |
| 2018-02-24 | 85.57 | 44.35 |
| 2018-02-23 | 86.494 | 44.83 |
| 2018-02-22 | 87.588 | 45.4 |
| 2018-02-21 | 88.681 | 45.96 |
| 2018-02-20 | 89.776 | 46.53 |
| 2018-02-19 | 90.844 | 47.08 |
| 2018-02-18 | 91.912 | 47.64 |
| 2018-02-17 | 92.722 | 48.06 |
| 2018-02-16 | 93.675 | 48.55 |
| 2018-02-15 | 94.704 | 49.08 |
| 2018-02-14 | 95.78 | 49.64 |
| 2018-02-13 | 96.916 | 50.23 |
| 2018-02-12 | 98.051 | 50.82 |
| 2018-02-11 | 99.213 | 51.42 |
| 2018-02-10 | 100.017 | 51.84 |
| 2018-02-09 | 100.856 | 52.27 |
| 2018-02-08 | 101.922 | 52.83 |
| 2018-02-07 | 103.092 | 53.43 |
| 2018-02-06 | 104.305 | 54.06 |
| 2018-02-05 | 105.516 | 54.69 |
| 2018-02-04 | 106.685 | 55.29 |
| 2018-02-03 | 107.489 | 55.71 |
| 2018-02-02 | 108.325 | 56.14 |
| 2018-02-01 | 109.387 | 56.7 |
| 2018-01-31 | 110.556 | 57.3 |
| 2018-01-30 | 111.81 | 57.95 |
| 2018-01-29 | 113.095 | 58.62 |
| 2018-01-28 | 114.405 | 59.3 |
| 2018-01-27 | 115.252 | 59.74 |
| 2018-01-26 | 116.195 | 60.22 |
| 2018-01-25 | 117.44 | 60.87 |
| 2018-01-24 | 118.684 | 61.51 |
| 2018-01-23 | 119.969 | 62.18 |
| 2018-01-22 | 121.263 | 62.85 |
| 2018-01-21 | 122.49 | 63.49 |
| 2018-01-20 | 123.18 | 63.84 |
| 2018-01-19 | 124.127 | 64.33 |
| 2018-01-18 | 125.306 | 64.95 |
| 2018-01-17 | 126.553 | 65.59 |
| 2018-01-16 | 127.862 | 66.27 |
| 2018-01-15 | 129.184 | 66.96 |
| 2018-01-14 | 130.45 | 67.61 |
| 2018-01-13 | 131.392 | 68.1 |
| 2018-01-12 | 132.283 | 68.56 |
| 2018-01-11 | 133.405 | 69.14 |
| 2018-01-10 | 134.565 | 69.74 |
| 2018-01-09 | 135.58 | 70.27 |
| 2018-01-08 | 136.587 | 70.79 |
| 2018-01-07 | 137.505 | 71.27 |
| 2018-01-06 | 138.023 | 71.54 |
| 2018-01-05 | 138.476 | 71.77 |
| 2018-01-04 | 139.292 | 72.19 |
| 2018-01-03 | 140.168 | 72.65 |
| 2018-01-02 | 141.031 | 73.1 |
| 2018-01-01 | 141.708 | 73.45 |